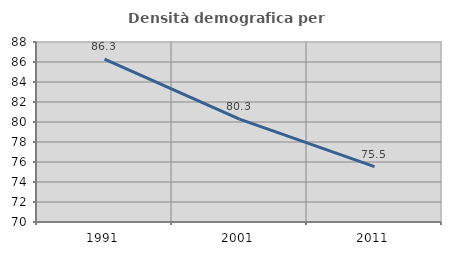
| Category | Densità demografica |
|---|---|
| 1991.0 | 86.276 |
| 2001.0 | 80.288 |
| 2011.0 | 75.539 |